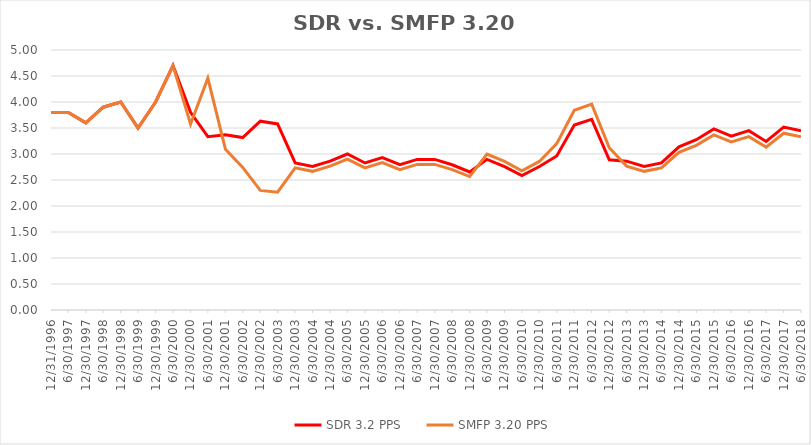
| Category | SDR 3.2 PPS | SMFP 3.20 PPS |
|---|---|---|
| 12/31/96 | 3.8 | 3.8 |
| 6/30/97 | 3.8 | 3.8 |
| 12/31/97 | 3.6 | 3.6 |
| 6/30/98 | 3.9 | 3.9 |
| 12/31/98 | 4 | 4 |
| 6/30/99 | 3.5 | 3.5 |
| 12/31/99 | 4 | 4 |
| 6/30/00 | 4.7 | 4.7 |
| 12/31/00 | 3.8 | 3.574 |
| 6/30/01 | 3.333 | 4.46 |
| 12/31/01 | 3.368 | 3.09 |
| 6/30/02 | 3.316 | 2.743 |
| 12/31/02 | 3.632 | 2.3 |
| 6/30/03 | 3.579 | 2.267 |
| 12/31/03 | 2.828 | 2.733 |
| 6/30/04 | 2.759 | 2.667 |
| 12/31/04 | 2.862 | 2.767 |
| 6/30/05 | 3 | 2.9 |
| 12/31/05 | 2.828 | 2.733 |
| 6/30/06 | 2.931 | 2.833 |
| 12/31/06 | 2.793 | 2.7 |
| 6/30/07 | 2.897 | 2.8 |
| 12/31/07 | 2.897 | 2.8 |
| 6/30/08 | 2.793 | 2.7 |
| 12/31/08 | 2.655 | 2.567 |
| 6/30/09 | 2.897 | 3 |
| 12/31/09 | 2.759 | 2.857 |
| 6/30/10 | 2.586 | 2.679 |
| 12/31/10 | 2.759 | 2.857 |
| 6/30/11 | 2.963 | 3.2 |
| 12/31/11 | 3.556 | 3.84 |
| 6/30/12 | 3.667 | 3.96 |
| 12/31/12 | 2.889 | 3.12 |
| 6/30/13 | 2.862 | 2.767 |
| 12/31/13 | 2.759 | 2.667 |
| 6/30/14 | 2.828 | 2.733 |
| 12/31/14 | 3.138 | 3.033 |
| 6/30/15 | 3.276 | 3.167 |
| 12/31/15 | 3.483 | 3.367 |
| 6/30/16 | 3.345 | 3.233 |
| 12/31/16 | 3.448 | 3.333 |
| 6/30/17 | 3.241 | 3.133 |
| 12/31/17 | 3.517 | 3.4 |
| 6/30/18 | 3.448 | 3.333 |